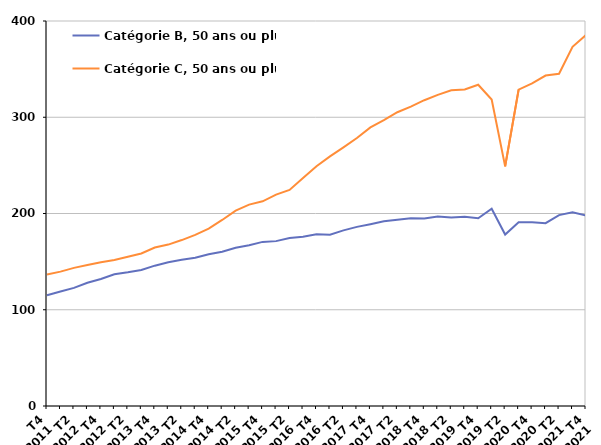
| Category | Catégorie B, 50 ans ou plus | Catégorie C, 50 ans ou plus |
|---|---|---|
| T4
2011 | 115 | 136.6 |
| T1
2012 | 118.9 | 139.6 |
| T2
2012 | 122.7 | 143.5 |
| T3
2012 | 128.1 | 146.4 |
| T4
2012 | 131.9 | 149.3 |
| T1
2013 | 136.9 | 151.6 |
| T2
2013 | 138.9 | 155 |
| T3
2013 | 141.3 | 158.5 |
| T4
2013 | 145.8 | 164.6 |
| T1
2014 | 149.3 | 167.7 |
| T2
2014 | 152 | 172.4 |
| T3
2014 | 154.1 | 177.8 |
| T4
2014 | 157.7 | 184.3 |
| T1
2015 | 160.3 | 193.3 |
| T2
2015 | 164.5 | 203 |
| T3
2015 | 167.1 | 209.2 |
| T4
2015 | 170.5 | 212.7 |
| T1
2016 | 171.3 | 219.6 |
| T2
2016 | 174.5 | 224.5 |
| T3
2016 | 175.9 | 236.9 |
| T4
2016 | 178.5 | 249.1 |
| T1
2017 | 178 | 259.3 |
| T2
2017 | 182.5 | 268.7 |
| T3
2017 | 186.1 | 278.4 |
| T4
2017 | 188.9 | 289.4 |
| T1
2018 | 191.9 | 297 |
| T2
2018 | 193.4 | 305.2 |
| T3
2018 | 195.1 | 311.1 |
| T4
2018 | 194.9 | 317.7 |
| T1
2019 | 196.8 | 323.3 |
| T2
2019 | 195.8 | 328.1 |
| T3
2019 | 196.5 | 328.9 |
| T4
2019 | 195.1 | 333.8 |
| T1
2020 | 205 | 318.4 |
| T2
2020 | 178.1 | 249 |
| T3
2020 | 190.9 | 328.7 |
| T4
2020 | 190.8 | 335.1 |
| T1
2021 | 189.9 | 343.3 |
| T2
2021 | 198.3 | 345.2 |
| T3
2021 | 201.2 | 373.2 |
| T4
2021 | 197.9 | 385.5 |